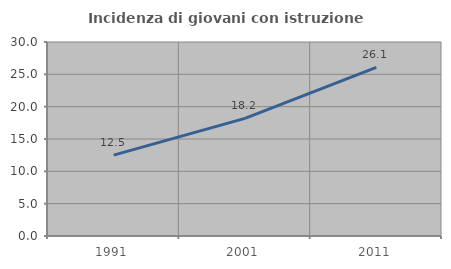
| Category | Incidenza di giovani con istruzione universitaria |
|---|---|
| 1991.0 | 12.5 |
| 2001.0 | 18.182 |
| 2011.0 | 26.087 |